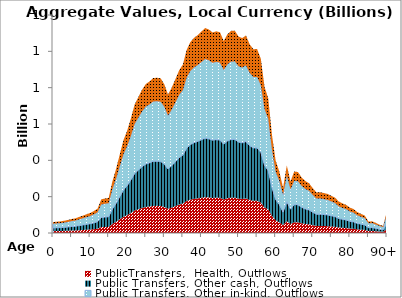
| Category | PublicTransfers,  Health, Outflows | Public Transfers, Other cash, Outflows | Public Transfers, Other in-kind, Outflows | Public Transfers, Education, Outflows |
|---|---|---|---|---|
| 0 | 10.533 | 17.352 | 23.25 | 9.114 |
|  | 10.88 | 17.923 | 24.015 | 9.414 |
| 2 | 11.162 | 18.388 | 24.638 | 9.658 |
| 3 | 11.803 | 19.445 | 26.054 | 10.213 |
| 4 | 12.529 | 20.641 | 27.657 | 10.841 |
| 5 | 13.47 | 22.191 | 29.733 | 11.655 |
| 6 | 14.053 | 23.151 | 31.02 | 12.16 |
| 7 | 15.43 | 25.42 | 34.059 | 13.351 |
| 8 | 16.603 | 27.352 | 36.647 | 14.366 |
| 9 | 18.016 | 29.681 | 39.768 | 15.589 |
| 10 | 19.204 | 31.637 | 42.389 | 16.617 |
| 11 | 21.118 | 34.79 | 46.614 | 18.273 |
| 12 | 23.442 | 38.619 | 51.745 | 20.284 |
| 13 | 32.359 | 53.309 | 71.426 | 27.999 |
| 14 | 33.192 | 54.681 | 73.265 | 28.72 |
| 15 | 33.797 | 55.678 | 74.601 | 29.244 |
| 16 | 49.568 | 81.66 | 109.414 | 42.891 |
| 17 | 61.683 | 101.619 | 136.155 | 53.373 |
| 18 | 75.727 | 124.756 | 167.156 | 65.525 |
| 19 | 89.482 | 147.415 | 197.516 | 77.427 |
| 20 | 98.595 | 162.428 | 217.631 | 85.312 |
| 21 | 110.469 | 181.99 | 243.842 | 95.587 |
| 22 | 123.649 | 203.704 | 272.936 | 106.992 |
| 23 | 130.853 | 215.571 | 288.835 | 113.224 |
| 24 | 137.855 | 227.107 | 304.292 | 119.283 |
| 25 | 143.333 | 236.132 | 316.384 | 124.023 |
| 26 | 145.839 | 240.26 | 321.916 | 126.192 |
| 27 | 149.132 | 245.684 | 329.183 | 129.041 |
| 28 | 149.381 | 246.095 | 329.734 | 129.257 |
| 29 | 148.892 | 245.289 | 328.654 | 128.833 |
| 30 | 143.041 | 235.65 | 315.739 | 123.771 |
| 31 | 133.137 | 219.334 | 293.877 | 115.201 |
| 32 | 140.075 | 230.764 | 309.192 | 121.204 |
| 33 | 148.193 | 244.138 | 327.112 | 128.229 |
| 34 | 156.623 | 258.026 | 345.72 | 135.523 |
| 35 | 162.142 | 267.118 | 357.902 | 140.298 |
| 36 | 176.09 | 290.097 | 388.69 | 152.368 |
| 37 | 183.703 | 302.639 | 405.495 | 158.955 |
| 38 | 187.78 | 309.356 | 414.494 | 162.483 |
| 39 | 190.471 | 313.788 | 420.433 | 164.811 |
| 40 | 193.891 | 319.423 | 427.983 | 167.771 |
| 41 | 197.265 | 324.98 | 435.429 | 170.689 |
| 42 | 195.864 | 322.673 | 432.337 | 169.477 |
| 43 | 192.96 | 317.889 | 425.928 | 166.965 |
| 44 | 194.088 | 319.747 | 428.418 | 167.941 |
| 45 | 193.159 | 318.216 | 426.366 | 167.137 |
| 46 | 184.809 | 304.461 | 407.936 | 159.912 |
| 47 | 191.258 | 315.084 | 422.17 | 165.492 |
| 48 | 194.507 | 320.437 | 429.342 | 168.303 |
| 49 | 194.622 | 320.627 | 429.597 | 168.403 |
| 50 | 189.035 | 311.422 | 417.263 | 163.568 |
| 51 | 187.62 | 309.091 | 414.14 | 162.344 |
| 52 | 190.108 | 313.191 | 419.633 | 164.497 |
| 53 | 181.551 | 299.093 | 400.744 | 157.093 |
| 54 | 176.913 | 291.452 | 390.506 | 153.079 |
| 55 | 176.996 | 291.589 | 390.689 | 153.151 |
| 56 | 167.706 | 276.285 | 370.184 | 145.113 |
| 57 | 140.61 | 231.645 | 310.373 | 121.667 |
| 58 | 129.549 | 213.423 | 285.957 | 112.096 |
| 59 | 94.602 | 155.85 | 208.818 | 81.857 |
| 60 | 69.617 | 114.689 | 153.668 | 60.238 |
| 61 | 58.843 | 96.94 | 129.887 | 50.916 |
| 62 | 43.433 | 71.553 | 95.871 | 37.582 |
| 63 | 65.084 | 107.221 | 143.662 | 56.316 |
| 64 | 49.528 | 81.594 | 109.325 | 42.856 |
| 65 | 59.232 | 97.581 | 130.745 | 51.252 |
| 66 | 58.686 | 96.681 | 129.539 | 50.78 |
| 67 | 53.482 | 88.108 | 118.052 | 46.277 |
| 68 | 49.975 | 82.331 | 110.312 | 43.243 |
| 69 | 47.908 | 78.925 | 105.748 | 41.454 |
| 70 | 43.152 | 71.09 | 95.251 | 37.339 |
| 71 | 39.053 | 64.337 | 86.202 | 33.791 |
| 72 | 39.237 | 64.641 | 86.61 | 33.951 |
| 73 | 38.455 | 63.352 | 84.883 | 33.274 |
| 74 | 37.606 | 61.953 | 83.009 | 32.54 |
| 75 | 35.837 | 59.04 | 79.105 | 31.009 |
| 76 | 34.024 | 56.052 | 75.102 | 29.44 |
| 77 | 30.25 | 49.835 | 66.773 | 26.175 |
| 78 | 28.507 | 46.963 | 62.924 | 24.666 |
| 79 | 27.017 | 44.509 | 59.635 | 23.377 |
| 80 | 24.444 | 40.269 | 53.955 | 21.151 |
| 81 | 23.057 | 37.985 | 50.895 | 19.951 |
| 82 | 20.109 | 33.128 | 44.387 | 17.4 |
| 83 | 18.383 | 30.285 | 40.578 | 15.907 |
| 84 | 16.84 | 27.742 | 37.171 | 14.571 |
| 85 | 11.071 | 18.238 | 24.437 | 9.579 |
| 86 | 11.218 | 18.481 | 24.762 | 9.707 |
| 87 | 9.67 | 15.931 | 21.345 | 8.367 |
| 88 | 7.942 | 13.083 | 17.53 | 6.872 |
| 89 | 6.762 | 11.14 | 14.926 | 5.851 |
| 90+ | 21.165 | 34.868 | 46.718 | 18.314 |